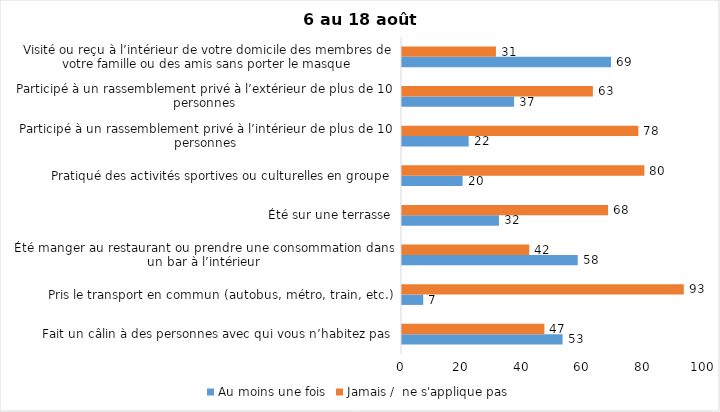
| Category | Au moins une fois | Jamais /  ne s'applique pas |
|---|---|---|
| Fait un câlin à des personnes avec qui vous n’habitez pas | 53 | 47 |
| Pris le transport en commun (autobus, métro, train, etc.) | 7 | 93 |
| Été manger au restaurant ou prendre une consommation dans un bar à l’intérieur | 58 | 42 |
| Été sur une terrasse | 32 | 68 |
| Pratiqué des activités sportives ou culturelles en groupe | 20 | 80 |
| Participé à un rassemblement privé à l’intérieur de plus de 10 personnes | 22 | 78 |
| Participé à un rassemblement privé à l’extérieur de plus de 10 personnes | 37 | 63 |
| Visité ou reçu à l’intérieur de votre domicile des membres de votre famille ou des amis sans porter le masque | 69 | 31 |